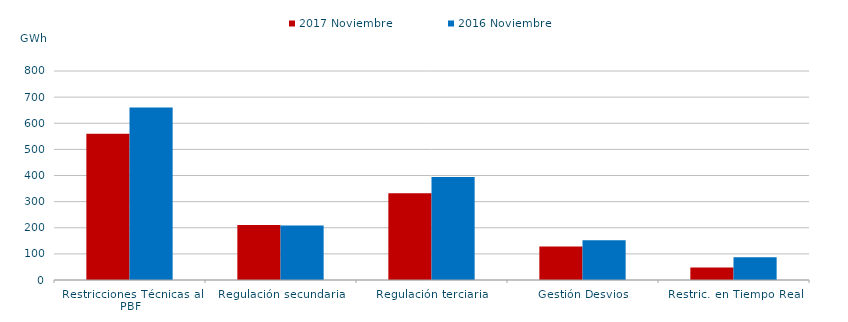
| Category | 2017 | 2016 |
|---|---|---|
| Restricciones Técnicas al PBF | 559.729 | 659.989 |
| Regulación secundaria | 210.636 | 208.855 |
| Regulación terciaria | 332.503 | 394.001 |
| Gestión Desvios | 128.53 | 151.954 |
| Restric. en Tiempo Real | 47.947 | 87.465 |